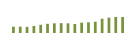
| Category | Saldo [ (1)-(2) ] |
|---|---|
| 0 | 203117.024 |
| 1 | 204244.864 |
| 2 | 198400.412 |
| 3 | 227324.117 |
| 4 | 264760.339 |
| 5 | 296419.004 |
| 6 | 312165.442 |
| 7 | 318321.614 |
| 8 | 312463.312 |
| 9 | 291587.274 |
| 10 | 334649.348 |
| 11 | 344816.778 |
| 12 | 363008.511 |
| 13 | 460327.444 |
| 14 | 495580.342 |
| 15 | 518031.638 |
| 16 | 517378.964 |